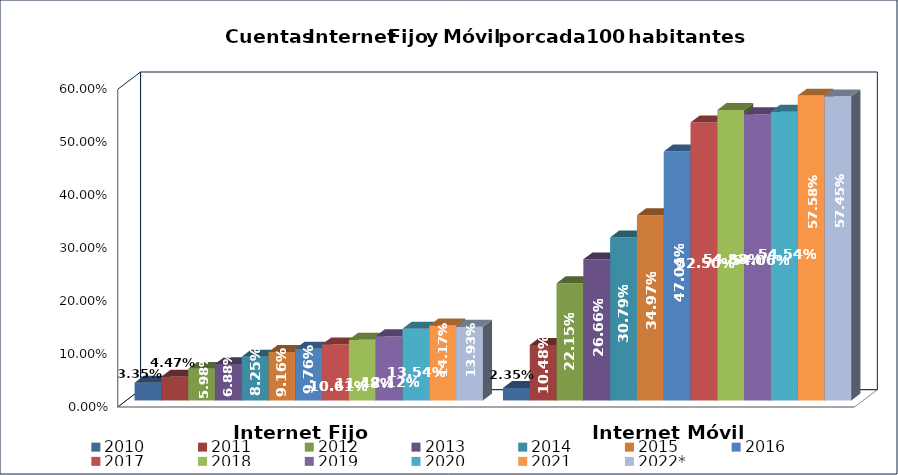
| Category | 2010 | 2011 | 2012 | 2013 | 2014 | 2015 | 2016 | 2017 | 2018 | 2019 | 2020 | 2021 | 2022* |
|---|---|---|---|---|---|---|---|---|---|---|---|---|---|
| Internet Fijo | 0.033 | 0.045 | 0.06 | 0.069 | 0.083 | 0.092 | 0.098 | 0.106 | 0.115 | 0.121 | 0.135 | 0.142 | 0.139 |
| Internet Móvil | 0.024 | 0.105 | 0.222 | 0.267 | 0.308 | 0.35 | 0.47 | 0.525 | 0.549 | 0.541 | 0.545 | 0.576 | 0.574 |